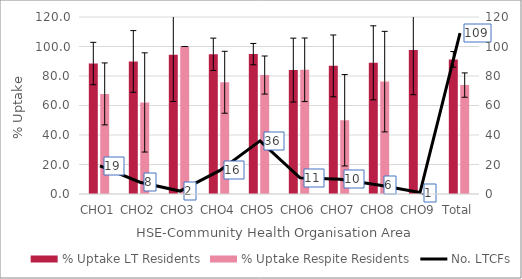
| Category | % Uptake LT Residents | % Uptake Respite Residents |
|---|---|---|
| 0 | 88.462 | 67.857 |
| 1 | 89.865 | 62.069 |
| 2 | 94.444 | 100 |
| 3 | 94.706 | 75.758 |
| 4 | 94.837 | 80.645 |
| 5 | 84 | 84.211 |
| 6 | 86.866 | 50 |
| 7 | 88.938 | 76.19 |
| 8 | 97.561 | 0 |
| 9 | 91.27 | 73.846 |